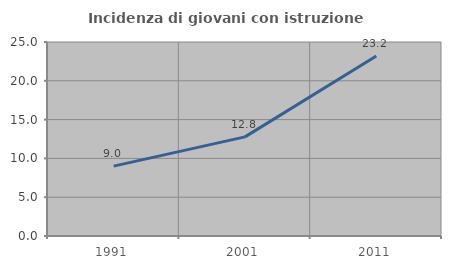
| Category | Incidenza di giovani con istruzione universitaria |
|---|---|
| 1991.0 | 9 |
| 2001.0 | 12.775 |
| 2011.0 | 23.188 |